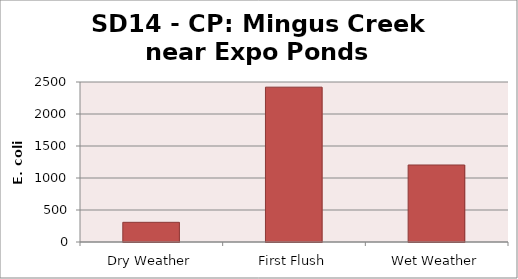
| Category | E. coli MPN |
|---|---|
| Dry Weather | 307.6 |
| First Flush | 2419.2 |
| Wet Weather | 1203.3 |